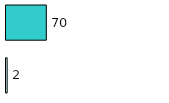
| Category | Series 0 | Series 1 |
|---|---|---|
| 0 | 2 | 70 |